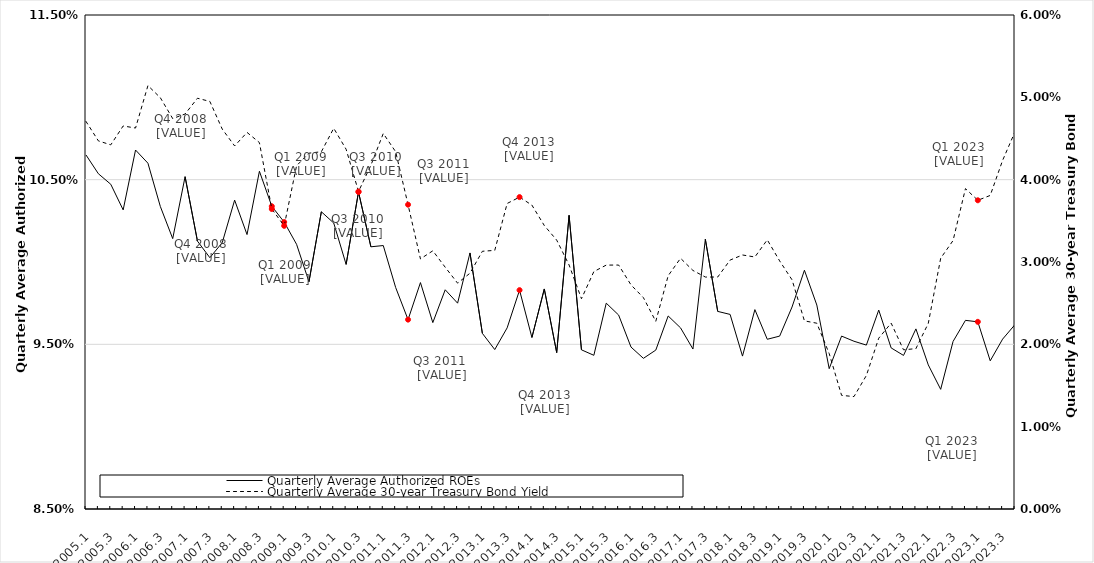
| Category | Quarterly Average Authorized ROEs |
|---|---|
| 2005.1 | 0.107 |
| 2005.2 | 0.105 |
| 2005.3 | 0.105 |
| 2005.4 | 0.103 |
| 2006.1 | 0.107 |
| 2006.2 | 0.106 |
| 2006.3 | 0.103 |
| 2006.4 | 0.101 |
| 2007.1 | 0.105 |
| 2007.2 | 0.101 |
| 2007.3 | 0.1 |
| 2007.4 | 0.101 |
| 2008.1 | 0.104 |
| 2008.2 | 0.102 |
| 2008.3 | 0.106 |
| 2008.4 | 0.103 |
| 2009.1 | 0.102 |
| 2009.2 | 0.101 |
| 2009.3 | 0.099 |
| 2009.4 | 0.103 |
| 2010.1 | 0.102 |
| 2010.2 | 0.1 |
| 2010.3 | 0.104 |
| 2010.4 | 0.101 |
| 2011.1 | 0.101 |
| 2011.2 | 0.098 |
| 2011.3 | 0.096 |
| 2011.4 | 0.099 |
| 2012.1 | 0.096 |
| 2012.2 | 0.098 |
| 2012.3 | 0.098 |
| 2012.4 | 0.101 |
| 2013.1 | 0.096 |
| 2013.2 | 0.095 |
| 2013.3 | 0.096 |
| 2013.4 | 0.098 |
| 2014.1 | 0.095 |
| 2014.2 | 0.098 |
| 2014.3 | 0.095 |
| 2014.4 | 0.103 |
| 2015.1 | 0.095 |
| 2015.2 | 0.094 |
| 2015.3 | 0.098 |
| 2015.4 | 0.097 |
| 2016.1 | 0.095 |
| 2016.2 | 0.094 |
| 2016.3 | 0.095 |
| 2016.4 | 0.097 |
| 2017.1 | 0.096 |
| 2017.2 | 0.095 |
| 2017.3 | 0.101 |
| 2017.4 | 0.097 |
| 2018.1 | 0.097 |
| 2018.2 | 0.094 |
| 2018.3 | 0.097 |
| 2018.4 | 0.095 |
| 2019.1 | 0.096 |
| 2019.2 | 0.097 |
| 2019.3 | 0.1 |
| 2019.4 | 0.097 |
| 2020.1 | 0.094 |
| 2020.2 | 0.095 |
| 2020.3 | 0.095 |
| 2020.4 | 0.095 |
| 2021.1 | 0.097 |
| 2021.2 | 0.095 |
| 2021.3 | 0.094 |
| 2021.4 | 0.096 |
| 2022.1 | 0.094 |
| 2022.2 | 0.092 |
| 2022.3 | 0.095 |
| 2022.4 | 0.096 |
| 2023.1 | 0.096 |
| 2023.2 | 0.094 |
| 2023.3 | 0.095 |
| 2023.4 | 0.096 |